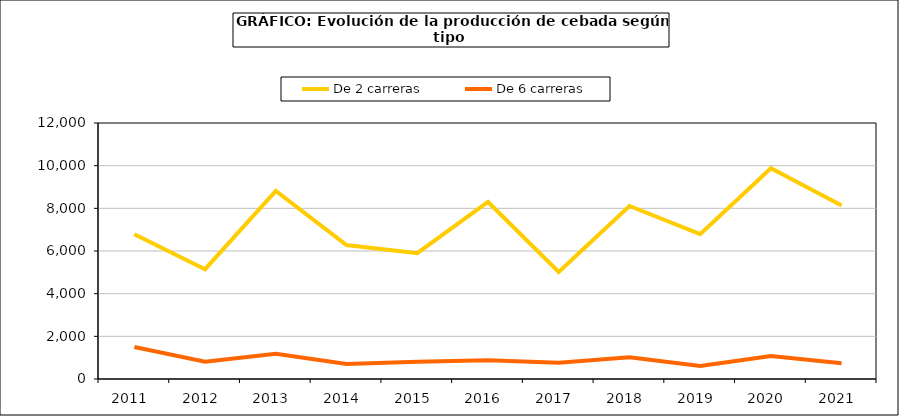
| Category | De 2 carreras | De 6 carreras |
|---|---|---|
| 2011  | 6787.058 | 1500.015 |
| 2012  | 5147.521 | 808.824 |
| 2013  | 8817.648 | 1187.35 |
| 2014  | 6278.967 | 704.322 |
| 2015  | 5895.806 | 809.3 |
| 2016  | 8298.027 | 878.132 |
| 2017  | 5019.581 | 766.363 |
| 2018  | 8108.866 | 1020.669 |
| 2019  | 6787.541 | 612.425 |
| 2020  | 9881.618 | 1074.162 |
| 2021  | 8128.906 | 734.753 |